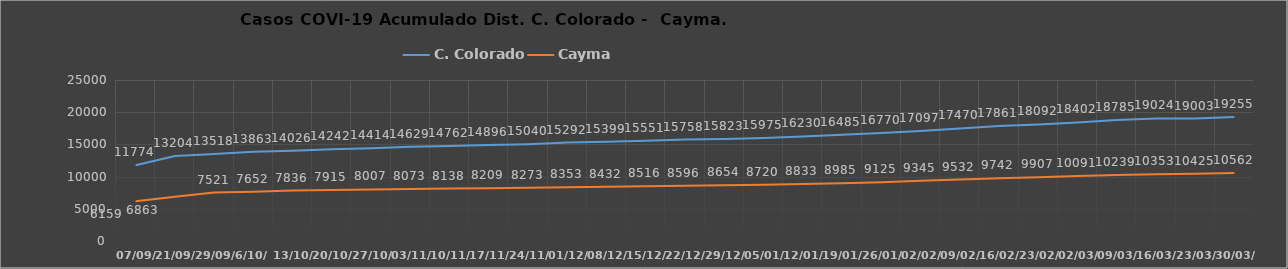
| Category | C. Colorado | Cayma |
|---|---|---|
| 07/09/ | 11774 | 6159 |
| 21/09/ | 13204 | 6863 |
| 29/09/ | 13518 | 7521 |
| 6/10/ | 13863 | 7652 |
| 13/10/ | 14026 | 7836 |
| 20/10/ | 14242 | 7915 |
| 27/10/ | 14414 | 8007 |
| 03/11/ | 14629 | 8073 |
| 10/11/ | 14762 | 8138 |
| 17/11/ | 14896 | 8209 |
| 24/11/ | 15040 | 8273 |
| 01/12/ | 15292 | 8353 |
| 08/12/ | 15399 | 8432 |
| 15/12/ | 15551 | 8516 |
| 22/12/ | 15758 | 8596 |
| 29/12/ | 15823 | 8654 |
| 05/01/ | 15975 | 8720 |
| 12/01/ | 16230 | 8833 |
| 19/01/ | 16485 | 8985 |
| 26/01/ | 16770 | 9125 |
| 02/02/ | 17097 | 9345 |
| 09/02/ | 17470 | 9532 |
| 16/02/ | 17861 | 9742 |
| 23/02/ | 18092 | 9907 |
| 02/03/ | 18402 | 10091 |
| 09/03/ | 18785 | 10239 |
| 16/03/ | 19024 | 10353 |
| 23/03/ | 19003 | 10425 |
| 30/03/ | 19255 | 10562 |